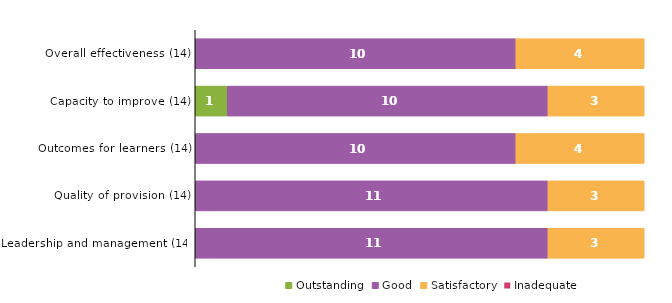
| Category | Outstanding | Good | Satisfactory | Inadequate |
|---|---|---|---|---|
| Overall effectiveness (14) | 0 | 10 | 4 | 0 |
| Capacity to improve (14) | 1 | 10 | 3 | 0 |
| Outcomes for learners (14) | 0 | 10 | 4 | 0 |
| Quality of provision (14) | 0 | 11 | 3 | 0 |
| Leadership and management (14) | 0 | 11 | 3 | 0 |